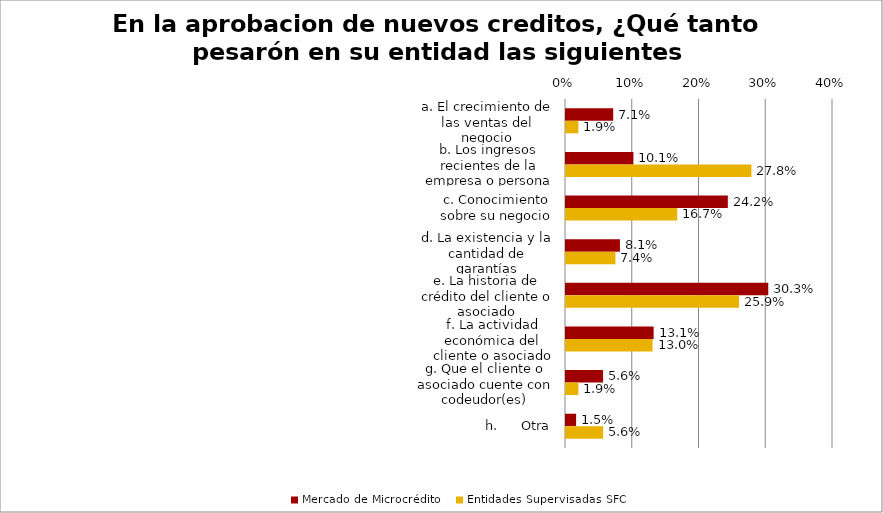
| Category | Mercado de Microcrédito | Entidades Supervisadas SFC |
|---|---|---|
| a. El crecimiento de las ventas del negocio | 0.071 | 0.019 |
| b. Los ingresos recientes de la empresa o persona natural | 0.101 | 0.278 |
| c. Conocimiento sobre su negocio | 0.242 | 0.167 |
| d. La existencia y la cantidad de garantías | 0.081 | 0.074 |
| e. La historia de crédito del cliente o asociado | 0.303 | 0.259 |
| f. La actividad económica del cliente o asociado | 0.131 | 0.13 |
| g. Que el cliente o asociado cuente con codeudor(es) | 0.056 | 0.019 |
| h.      Otra | 0.015 | 0.056 |